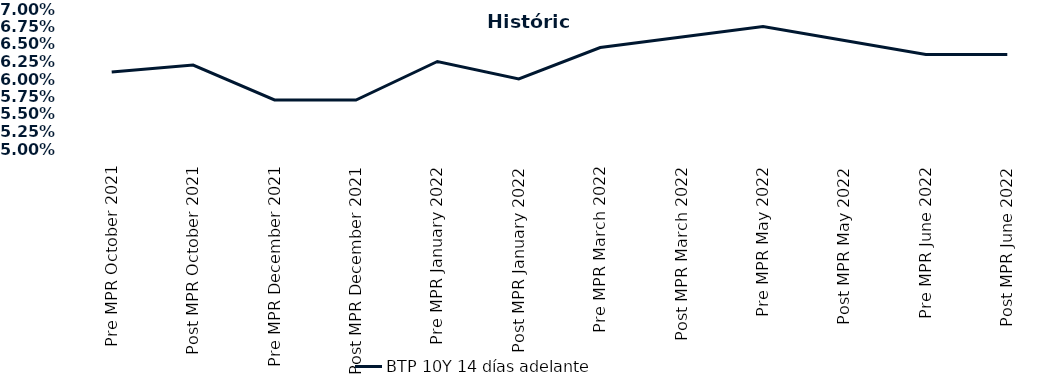
| Category | BTP 10Y 14 días adelante |
|---|---|
| Pre MPR October 2021 | 0.061 |
| Post MPR October 2021 | 0.062 |
| Pre MPR December 2021 | 0.057 |
| Post MPR December 2021 | 0.057 |
| Pre MPR January 2022 | 0.062 |
| Post MPR January 2022 | 0.06 |
| Pre MPR March 2022 | 0.064 |
| Post MPR March 2022 | 0.066 |
| Pre MPR May 2022 | 0.068 |
| Post MPR May 2022 | 0.066 |
| Pre MPR June 2022 | 0.064 |
| Post MPR June 2022 | 0.064 |